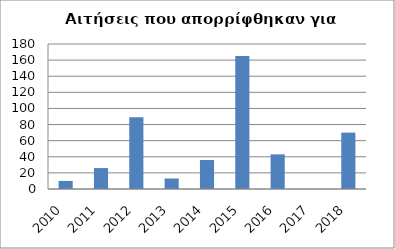
| Category | Series 0 |
|---|---|
| 2010.0 | 10 |
| 2011.0 | 26 |
| 2012.0 | 89 |
| 2013.0 | 13 |
| 2014.0 | 36 |
| 2015.0 | 165 |
| 2016.0 | 43 |
| 2017.0 | 0 |
| 2018.0 | 70 |